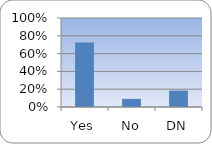
| Category | Series 0 |
|---|---|
| Yes | 0.724 |
| No | 0.091 |
| DN | 0.185 |